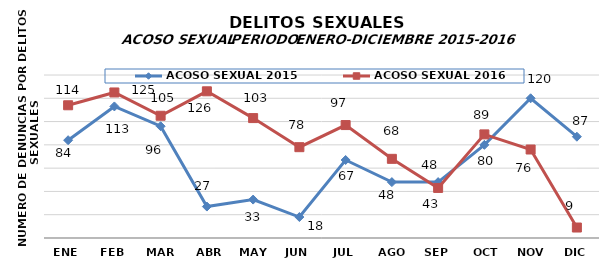
| Category | ACOSO SEXUAL 2015 | ACOSO SEXUAL 2016 |
|---|---|---|
| ENE | 84 | 114 |
| FEB | 113 | 125 |
| MAR | 96 | 105 |
| ABR | 27 | 126 |
| MAY | 33 | 103 |
| JUN | 18 | 78 |
| JUL | 67 | 97 |
| AGO | 48 | 68 |
| SEP | 48 | 43 |
| OCT | 80 | 89 |
| NOV | 120 | 76 |
| DIC | 87 | 9 |